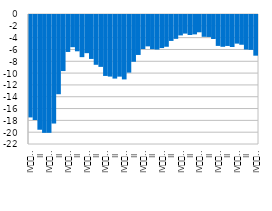
| Category | Current account 
(% of GDP) |
|---|---|
| IV
2007 | -17.335 |
| I | -17.769 |
| II | -19.419 |
| III | -19.947 |
| IV
2008 | -19.941 |
| I | -18.368 |
| II | -13.408 |
| III | -9.485 |
| IV
2009 | -6.254 |
| I | -5.448 |
| II | -6.144 |
| III | -7.133 |
| IV
2010 | -6.459 |
| I | -7.436 |
| II | -8.428 |
| III | -8.779 |
| IV
2011 | -10.313 |
| I | -10.421 |
| II | -10.762 |
| III | -10.432 |
| IV
2012 | -10.901 |
| I | -9.751 |
| II | -7.918 |
| III | -6.762 |
| IV
2013 | -5.761 |
| I | -5.308 |
| II | -5.776 |
| III | -5.85 |
| IV
2014 | -5.596 |
| I | -5.376 |
| II | -4.387 |
| III | -4.038 |
| IV
2015 | -3.454 |
| I | -3.149 |
| II | -3.384 |
| III | -3.279 |
| IV
2016 | -2.927 |
| I | -3.692 |
| II | -3.715 |
| III | -4.058 |
| IV
2017 | -5.23 |
| I | -5.381 |
| II | -5.239 |
| III | -5.42 |
| IV
2018 | -4.844 |
| I | -5.035 |
| II | -5.838 |
| III | -5.902 |
| IV
2019 | -6.882 |